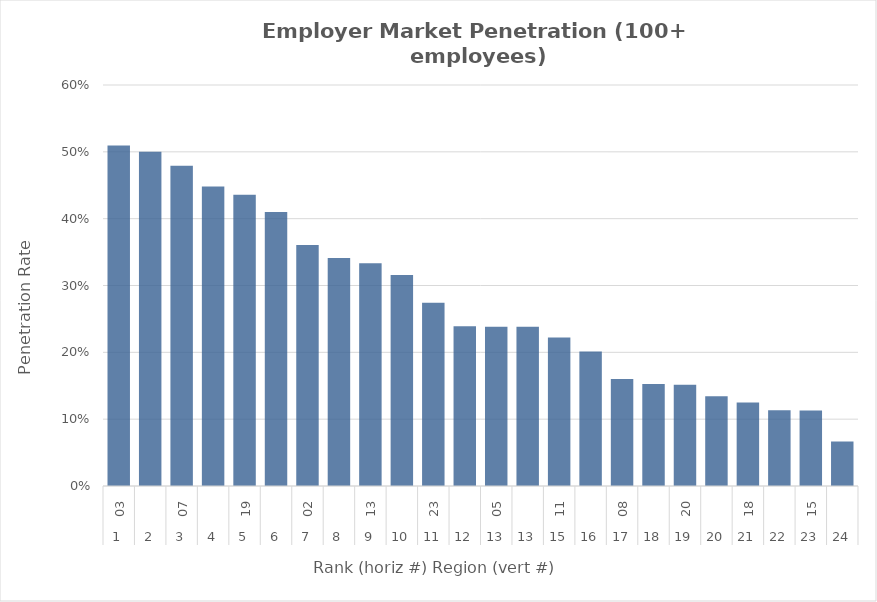
| Category | Rate |
|---|---|
| 0 | 0.509 |
| 1 | 0.5 |
| 2 | 0.479 |
| 3 | 0.448 |
| 4 | 0.436 |
| 5 | 0.41 |
| 6 | 0.361 |
| 7 | 0.341 |
| 8 | 0.333 |
| 9 | 0.316 |
| 10 | 0.274 |
| 11 | 0.239 |
| 12 | 0.238 |
| 13 | 0.238 |
| 14 | 0.222 |
| 15 | 0.201 |
| 16 | 0.16 |
| 17 | 0.153 |
| 18 | 0.151 |
| 19 | 0.134 |
| 20 | 0.125 |
| 21 | 0.113 |
| 22 | 0.113 |
| 23 | 0.067 |